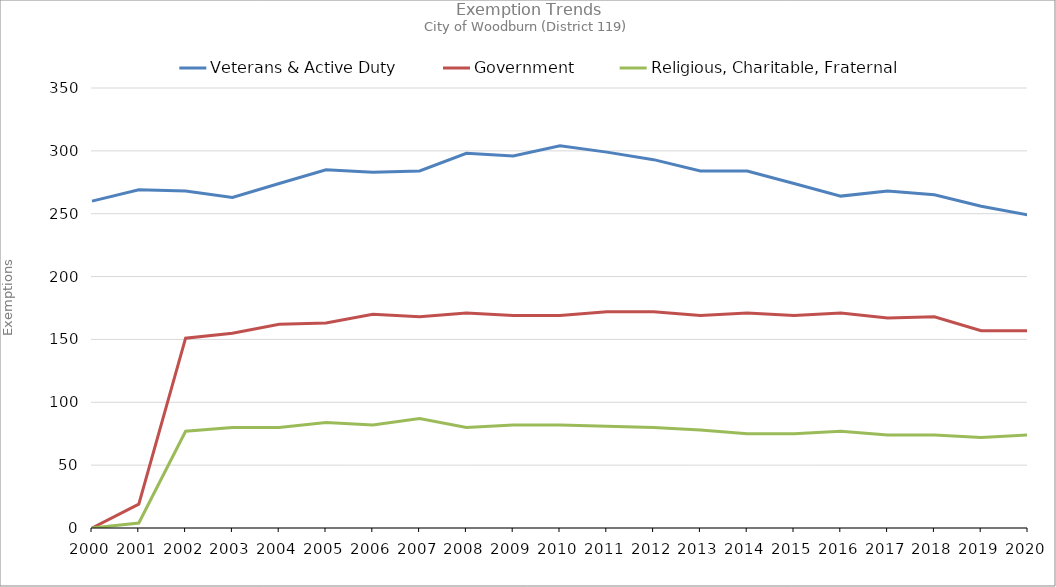
| Category | Veterans & Active Duty | Government | Religious, Charitable, Fraternal |
|---|---|---|---|
| 2000.0 | 260 | 0 | 0 |
| 2001.0 | 269 | 19 | 4 |
| 2002.0 | 268 | 151 | 77 |
| 2003.0 | 263 | 155 | 80 |
| 2004.0 | 274 | 162 | 80 |
| 2005.0 | 285 | 163 | 84 |
| 2006.0 | 283 | 170 | 82 |
| 2007.0 | 284 | 168 | 87 |
| 2008.0 | 298 | 171 | 80 |
| 2009.0 | 296 | 169 | 82 |
| 2010.0 | 304 | 169 | 82 |
| 2011.0 | 299 | 172 | 81 |
| 2012.0 | 293 | 172 | 80 |
| 2013.0 | 284 | 169 | 78 |
| 2014.0 | 284 | 171 | 75 |
| 2015.0 | 274 | 169 | 75 |
| 2016.0 | 264 | 171 | 77 |
| 2017.0 | 268 | 167 | 74 |
| 2018.0 | 265 | 168 | 74 |
| 2019.0 | 256 | 157 | 72 |
| 2020.0 | 249 | 157 | 74 |